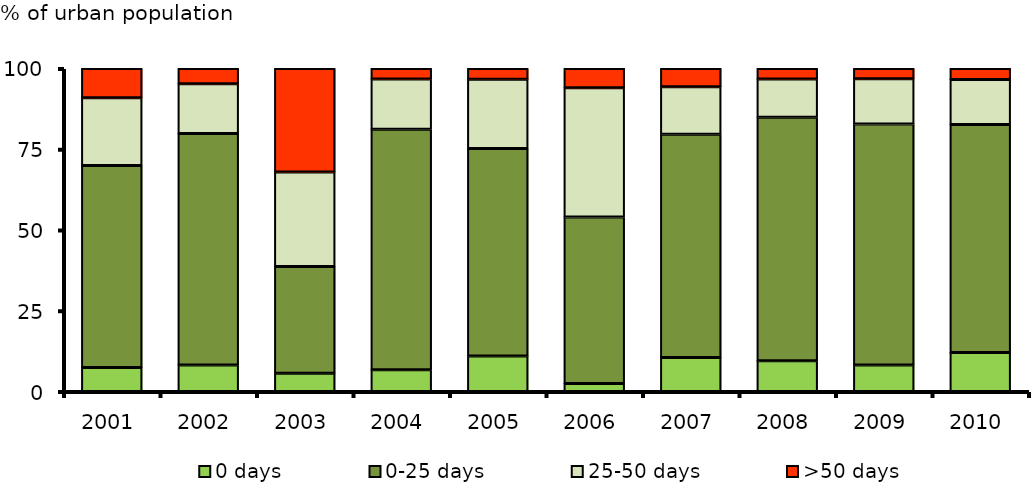
| Category | 0 days | 0-25 days | 25-50 days | >50 days |
|---|---|---|---|---|
| 2001.0 | 7.44 | 62.542 | 20.929 | 9.088 |
| 2002.0 | 8.185 | 71.686 | 15.382 | 4.747 |
| 2003.0 | 5.617 | 33.08 | 29.266 | 32.037 |
| 2004.0 | 6.726 | 74.483 | 15.524 | 3.268 |
| 2005.0 | 11.016 | 64.179 | 21.499 | 3.306 |
| 2006.0 | 2.515 | 51.481 | 40.021 | 5.982 |
| 2007.0 | 10.503 | 69.131 | 14.722 | 5.644 |
| 2008.0 | 9.521 | 75.384 | 11.857 | 3.238 |
| 2009.0 | 8.194 | 74.616 | 14.037 | 3.154 |
| 2010.0 | 12.086 | 70.579 | 13.942 | 3.394 |